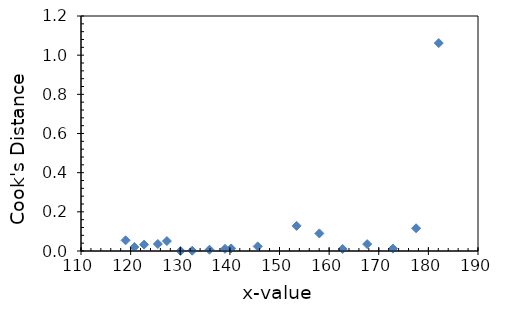
| Category | Series 0 |
|---|---|
| 118.99 | 0.055 |
| 120.76 | 0.02 |
| 122.71 | 0.032 |
| 125.48 | 0.036 |
| 127.31 | 0.051 |
| 130.06 | 0 |
| 132.41 | 0.002 |
| 135.89 | 0.007 |
| 139.02 | 0.011 |
| 140.25 | 0.013 |
| 145.61 | 0.023 |
| 153.45 | 0.128 |
| 158.03 | 0.09 |
| 162.72 | 0.01 |
| 167.67 | 0.035 |
| 172.86 | 0.012 |
| 177.52 | 0.116 |
| 182.09 | 1.062 |